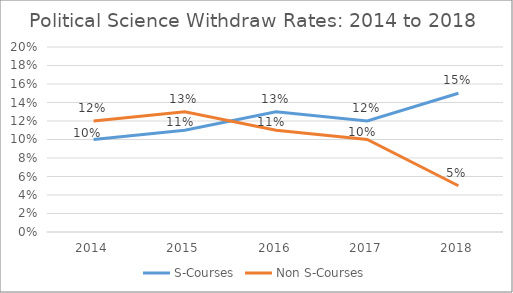
| Category | S-Courses | Non S-Courses |
|---|---|---|
| 2014.0 | 0.1 | 0.12 |
| 2015.0 | 0.11 | 0.13 |
| 2016.0 | 0.13 | 0.11 |
| 2017.0 | 0.12 | 0.1 |
| 2018.0 | 0.15 | 0.05 |